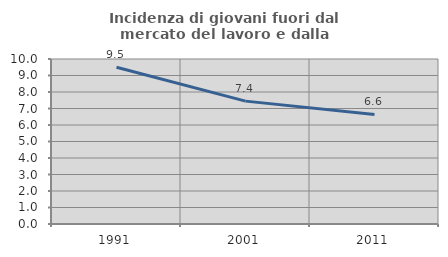
| Category | Incidenza di giovani fuori dal mercato del lavoro e dalla formazione  |
|---|---|
| 1991.0 | 9.503 |
| 2001.0 | 7.447 |
| 2011.0 | 6.641 |